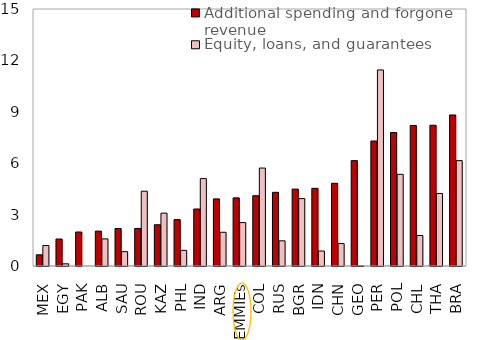
| Category | Additional spending and forgone revenue | Equity, loans, and guarantees |
|---|---|---|
| MEX | 0.653 | 1.195 |
| EGY | 1.574 | 0.128 |
| PAK | 1.984 | 0 |
| ALB | 2.034 | 1.583 |
| SAU | 2.19 | 0.836 |
| ROU | 2.192 | 4.365 |
| KAZ | 2.407 | 3.086 |
| PHL | 2.707 | 0.914 |
| IND | 3.327 | 5.101 |
| ARG | 3.916 | 1.969 |
| EMMIEs | 3.976 | 2.533 |
| COL | 4.102 | 5.716 |
| RUS | 4.3 | 1.47 |
| BGR | 4.488 | 3.934 |
| IDN | 4.532 | 0.876 |
| CHN | 4.827 | 1.309 |
| GEO | 6.149 | 0 |
| PER | 7.295 | 11.442 |
| POL | 7.79 | 5.352 |
| CHL | 8.204 | 1.781 |
| THA | 8.215 | 4.235 |
| BRA | 8.815 | 6.151 |